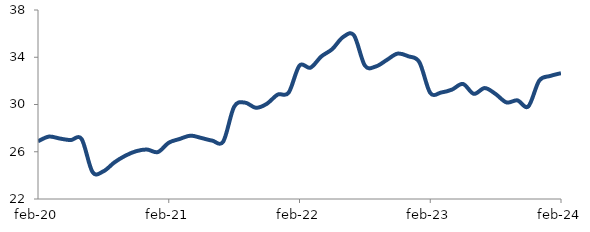
| Category | Series 0 |
|---|---|
| 2020-02-01 | 26.885 |
| 2020-03-01 | 27.282 |
| 2020-04-01 | 27.118 |
| 2020-05-01 | 26.986 |
| 2020-06-01 | 27.082 |
| 2020-07-01 | 24.291 |
| 2020-08-01 | 24.343 |
| 2020-09-01 | 25.089 |
| 2020-10-01 | 25.658 |
| 2020-11-01 | 26.044 |
| 2020-12-01 | 26.188 |
| 2021-01-01 | 25.972 |
| 2021-02-01 | 26.764 |
| 2021-03-01 | 27.083 |
| 2021-04-01 | 27.363 |
| 2021-05-01 | 27.164 |
| 2021-06-01 | 26.939 |
| 2021-07-01 | 26.864 |
| 2021-08-01 | 29.808 |
| 2021-09-01 | 30.158 |
| 2021-10-01 | 29.722 |
| 2021-11-01 | 30.058 |
| 2021-12-01 | 30.839 |
| 2022-01-01 | 30.999 |
| 2022-02-01 | 33.297 |
| 2022-03-01 | 33.114 |
| 2022-04-01 | 34.066 |
| 2022-05-01 | 34.685 |
| 2022-06-01 | 35.71 |
| 2022-07-01 | 35.85 |
| 2022-08-01 | 33.294 |
| 2022-09-01 | 33.218 |
| 2022-10-01 | 33.762 |
| 2022-11-01 | 34.307 |
| 2022-12-01 | 34.079 |
| 2023-01-01 | 33.585 |
| 2023-02-01 | 30.978 |
| 2023-03-01 | 31.014 |
| 2023-04-01 | 31.263 |
| 2023-05-01 | 31.74 |
| 2023-06-01 | 30.902 |
| 2023-07-01 | 31.392 |
| 2023-08-01 | 30.886 |
| 2023-09-01 | 30.175 |
| 2023-10-01 | 30.349 |
| 2023-11-01 | 29.836 |
| 2023-12-01 | 32.016 |
| 2024-01-01 | 32.413 |
| 2024-02-01 | 32.651 |